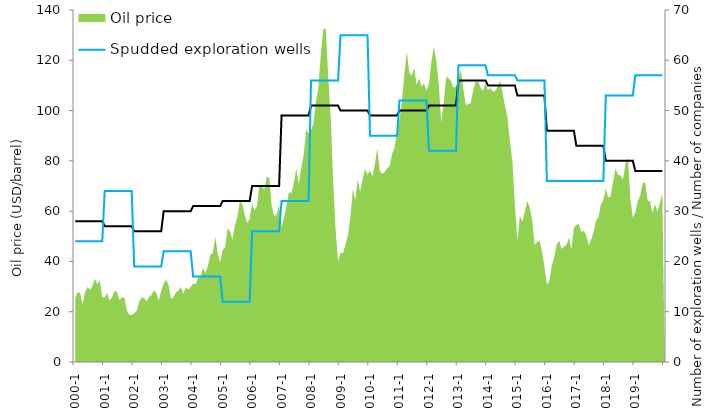
| Category | Number of companies on the shelf | Spudded exploration wells |
|---|---|---|
| 2000-1 | 28 | 24 |
| 2000-2 | 28 | 24 |
| 2000-3 | 28 | 24 |
| 2000-4 | 28 | 24 |
| 2000-5 | 28 | 24 |
| 2000-6 | 28 | 24 |
| 2000-7 | 28 | 24 |
| 2000-8 | 28 | 24 |
| 2000-9 | 28 | 24 |
| 2000-10 | 28 | 24 |
| 2000-11 | 28 | 24 |
| 2000-12 | 28 | 24 |
| 2001-1 | 27 | 34 |
| 2001-2 | 27 | 34 |
| 2001-3 | 27 | 34 |
| 2001-4 | 27 | 34 |
| 2001-5 | 27 | 34 |
| 2001-6 | 27 | 34 |
| 2001-7 | 27 | 34 |
| 2001-8 | 27 | 34 |
| 2001-9 | 27 | 34 |
| 2001-10 | 27 | 34 |
| 2001-11 | 27 | 34 |
| 2001-12 | 27 | 34 |
| 2002-1 | 26 | 19 |
| 2002-2 | 26 | 19 |
| 2002-3 | 26 | 19 |
| 2002-4 | 26 | 19 |
| 2002-5 | 26 | 19 |
| 2002-6 | 26 | 19 |
| 2002-7 | 26 | 19 |
| 2002-8 | 26 | 19 |
| 2002-9 | 26 | 19 |
| 2002-10 | 26 | 19 |
| 2002-11 | 26 | 19 |
| 2002-12 | 26 | 19 |
| 2003-1 | 30 | 22 |
| 2003-2 | 30 | 22 |
| 2003-3 | 30 | 22 |
| 2003-4 | 30 | 22 |
| 2003-5 | 30 | 22 |
| 2003-6 | 30 | 22 |
| 2003-7 | 30 | 22 |
| 2003-8 | 30 | 22 |
| 2003-9 | 30 | 22 |
| 2003-10 | 30 | 22 |
| 2003-11 | 30 | 22 |
| 2003-12 | 30 | 22 |
| 2004-1 | 31 | 17 |
| 2004-2 | 31 | 17 |
| 2004-3 | 31 | 17 |
| 2004-4 | 31 | 17 |
| 2004-5 | 31 | 17 |
| 2004-6 | 31 | 17 |
| 2004-7 | 31 | 17 |
| 2004-8 | 31 | 17 |
| 2004-9 | 31 | 17 |
| 2004-10 | 31 | 17 |
| 2004-11 | 31 | 17 |
| 2004-12 | 31 | 17 |
| 2005-1 | 32 | 12 |
| 2005-2 | 32 | 12 |
| 2005-3 | 32 | 12 |
| 2005-4 | 32 | 12 |
| 2005-5 | 32 | 12 |
| 2005-6 | 32 | 12 |
| 2005-7 | 32 | 12 |
| 2005-8 | 32 | 12 |
| 2005-9 | 32 | 12 |
| 2005-10 | 32 | 12 |
| 2005-11 | 32 | 12 |
| 2005-12 | 32 | 12 |
| 2006-1 | 35 | 26 |
| 2006-2 | 35 | 26 |
| 2006-3 | 35 | 26 |
| 2006-4 | 35 | 26 |
| 2006-5 | 35 | 26 |
| 2006-6 | 35 | 26 |
| 2006-7 | 35 | 26 |
| 2006-8 | 35 | 26 |
| 2006-9 | 35 | 26 |
| 2006-10 | 35 | 26 |
| 2006-11 | 35 | 26 |
| 2006-12 | 35 | 26 |
| 2007-1 | 49 | 32 |
| 2007-2 | 49 | 32 |
| 2007-3 | 49 | 32 |
| 2007-4 | 49 | 32 |
| 2007-5 | 49 | 32 |
| 2007-6 | 49 | 32 |
| 2007-7 | 49 | 32 |
| 2007-8 | 49 | 32 |
| 2007-9 | 49 | 32 |
| 2007-10 | 49 | 32 |
| 2007-11 | 49 | 32 |
| 2007-12 | 49 | 32 |
| 2008-1 | 51 | 56 |
| 2008-2 | 51 | 56 |
| 2008-3 | 51 | 56 |
| 2008-4 | 51 | 56 |
| 2008-5 | 51 | 56 |
| 2008-6 | 51 | 56 |
| 2008-7 | 51 | 56 |
| 2008-8 | 51 | 56 |
| 2008-9 | 51 | 56 |
| 2008-10 | 51 | 56 |
| 2008-11 | 51 | 56 |
| 2008-12 | 51 | 56 |
| 2009-1 | 50 | 65 |
| 2009-2 | 50 | 65 |
| 2009-3 | 50 | 65 |
| 2009-4 | 50 | 65 |
| 2009-5 | 50 | 65 |
| 2009-6 | 50 | 65 |
| 2009-7 | 50 | 65 |
| 2009-8 | 50 | 65 |
| 2009-9 | 50 | 65 |
| 2009-10 | 50 | 65 |
| 2009-11 | 50 | 65 |
| 2009-12 | 50 | 65 |
| 2010-1 | 49 | 45 |
| 2010-2 | 49 | 45 |
| 2010-3 | 49 | 45 |
| 2010-4 | 49 | 45 |
| 2010-5 | 49 | 45 |
| 2010-6 | 49 | 45 |
| 2010-7 | 49 | 45 |
| 2010-8 | 49 | 45 |
| 2010-9 | 49 | 45 |
| 2010-10 | 49 | 45 |
| 2010-11 | 49 | 45 |
| 2010-12 | 49 | 45 |
| 2011-1 | 50 | 52 |
| 2011-2 | 50 | 52 |
| 2011-3 | 50 | 52 |
| 2011-4 | 50 | 52 |
| 2011-5 | 50 | 52 |
| 2011-6 | 50 | 52 |
| 2011-7 | 50 | 52 |
| 2011-8 | 50 | 52 |
| 2011-9 | 50 | 52 |
| 2011-10 | 50 | 52 |
| 2011-11 | 50 | 52 |
| 2011-12 | 50 | 52 |
| 2012-1 | 51 | 42 |
| 2012-2 | 51 | 42 |
| 2012-3 | 51 | 42 |
| 2012-4 | 51 | 42 |
| 2012-5 | 51 | 42 |
| 2012-6 | 51 | 42 |
| 2012-7 | 51 | 42 |
| 2012-8 | 51 | 42 |
| 2012-9 | 51 | 42 |
| 2012-10 | 51 | 42 |
| 2012-11 | 51 | 42 |
| 2012-12 | 51 | 42 |
| 2013-1 | 56 | 59 |
| 2013-2 | 56 | 59 |
| 2013-3 | 56 | 59 |
| 2013-4 | 56 | 59 |
| 2013-5 | 56 | 59 |
| 2013-6 | 56 | 59 |
| 2013-7 | 56 | 59 |
| 2013-8 | 56 | 59 |
| 2013-9 | 56 | 59 |
| 2013-10 | 56 | 59 |
| 2013-11 | 56 | 59 |
| 2013-12 | 56 | 59 |
| 2014-1 | 55 | 57 |
| 2014-2 | 55 | 57 |
| 2014-3 | 55 | 57 |
| 2014-4 | 55 | 57 |
| 2014-5 | 55 | 57 |
| 2014-6 | 55 | 57 |
| 2014-7 | 55 | 57 |
| 2014-8 | 55 | 57 |
| 2014-9 | 55 | 57 |
| 2014-10 | 55 | 57 |
| 2014-11 | 55 | 57 |
| 2014-12 | 55 | 57 |
| 2015-1 | 53 | 56 |
| 2015-2 | 53 | 56 |
| 2015-3 | 53 | 56 |
| 2015-4 | 53 | 56 |
| 2015-5 | 53 | 56 |
| 2015-6 | 53 | 56 |
| 2015-7 | 53 | 56 |
| 2015-8 | 53 | 56 |
| 2015-9 | 53 | 56 |
| 2015-10 | 53 | 56 |
| 2015-11 | 53 | 56 |
| 2015-12 | 53 | 56 |
| 2016-1 | 46 | 36 |
| 2016-2 | 46 | 36 |
| 2016-3 | 46 | 36 |
| 2016-4 | 46 | 36 |
| 2016-5 | 46 | 36 |
| 2016-6 | 46 | 36 |
| 2016-7 | 46 | 36 |
| 2016-8 | 46 | 36 |
| 2016-9 | 46 | 36 |
| 2016-10 | 46 | 36 |
| 2016-11 | 46 | 36 |
| 2016-12 | 46 | 36 |
| 2017-1 | 43 | 36 |
| 2017-2 | 43 | 36 |
| 2017-3 | 43 | 36 |
| 2017-4 | 43 | 36 |
| 2017-5 | 43 | 36 |
| 2017-6 | 43 | 36 |
| 2017-7 | 43 | 36 |
| 2017-8 | 43 | 36 |
| 2017-9 | 43 | 36 |
| 2017-10 | 43 | 36 |
| 2017-11 | 43 | 36 |
| 2017-12 | 43 | 36 |
| 2018-1 | 40 | 53 |
| 2018-2 | 40 | 53 |
| 2018-3 | 40 | 53 |
| 2018-4 | 40 | 53 |
| 2018-5 | 40 | 53 |
| 2018-6 | 40 | 53 |
| 2018-7 | 40 | 53 |
| 2018-8 | 40 | 53 |
| 2018-9 | 40 | 53 |
| 2018-10 | 40 | 53 |
| 2018-11 | 40 | 53 |
| 2018-12 | 40 | 53 |
| 2019-1 | 38 | 57 |
| 2019-2 | 38 | 57 |
| 2019-3 | 38 | 57 |
| 2019-4 | 38 | 57 |
| 2019-5 | 38 | 57 |
| 2019-6 | 38 | 57 |
| 2019-7 | 38 | 57 |
| 2019-8 | 38 | 57 |
| 2019-9 | 38 | 57 |
| 2019-10 | 38 | 57 |
| 2019-11 | 38 | 57 |
| 2019-12 | 38 | 57 |